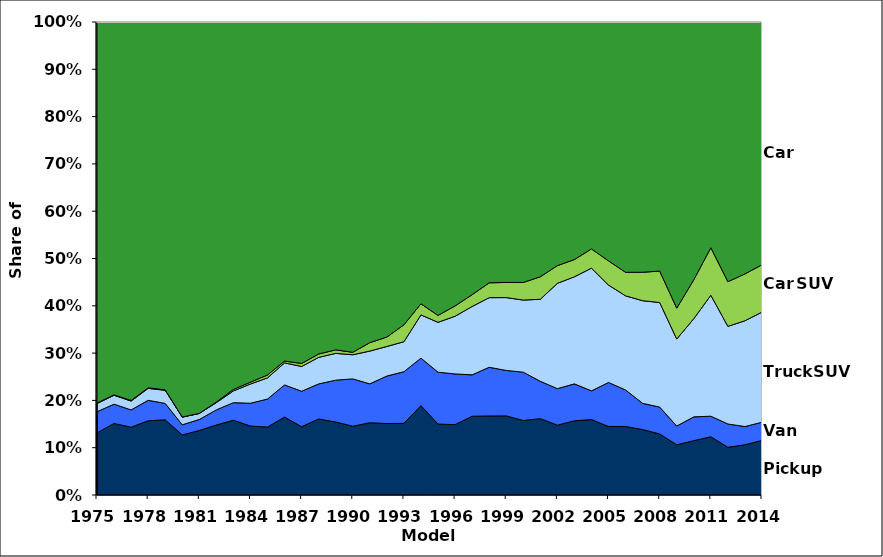
| Category | Pickup | Van | Truck SUV | Car SUV | Car |
|---|---|---|---|---|---|
| 1975.0 | 0.131 | 0.045 | 0.017 | 0.001 | 0.806 |
| 1976.0 | 0.151 | 0.041 | 0.019 | 0.001 | 0.788 |
| 1977.0 | 0.143 | 0.036 | 0.019 | 0.001 | 0.8 |
| 1978.0 | 0.157 | 0.043 | 0.025 | 0.001 | 0.773 |
| 1979.0 | 0.159 | 0.035 | 0.028 | 0.001 | 0.778 |
| 1980.0 | 0.127 | 0.021 | 0.016 | 0 | 0.835 |
| 1981.0 | 0.136 | 0.023 | 0.013 | 0 | 0.827 |
| 1982.0 | 0.148 | 0.032 | 0.015 | 0.001 | 0.803 |
| 1983.0 | 0.158 | 0.037 | 0.025 | 0.003 | 0.777 |
| 1984.0 | 0.146 | 0.048 | 0.041 | 0.004 | 0.761 |
| 1985.0 | 0.144 | 0.059 | 0.045 | 0.006 | 0.746 |
| 1986.0 | 0.165 | 0.068 | 0.046 | 0.004 | 0.717 |
| 1987.0 | 0.144 | 0.075 | 0.052 | 0.006 | 0.722 |
| 1988.0 | 0.161 | 0.074 | 0.056 | 0.007 | 0.702 |
| 1989.0 | 0.154 | 0.088 | 0.057 | 0.007 | 0.693 |
| 1990.0 | 0.145 | 0.1 | 0.051 | 0.005 | 0.698 |
| 1991.0 | 0.153 | 0.082 | 0.069 | 0.018 | 0.678 |
| 1992.0 | 0.151 | 0.1 | 0.062 | 0.02 | 0.666 |
| 1993.0 | 0.152 | 0.109 | 0.063 | 0.036 | 0.64 |
| 1994.0 | 0.189 | 0.1 | 0.091 | 0.023 | 0.596 |
| 1995.0 | 0.15 | 0.11 | 0.105 | 0.015 | 0.62 |
| 1996.0 | 0.149 | 0.107 | 0.122 | 0.022 | 0.6 |
| 1997.0 | 0.167 | 0.088 | 0.145 | 0.025 | 0.576 |
| 1998.0 | 0.167 | 0.103 | 0.147 | 0.031 | 0.551 |
| 1999.0 | 0.167 | 0.096 | 0.154 | 0.032 | 0.551 |
| 2000.0 | 0.158 | 0.102 | 0.152 | 0.037 | 0.551 |
| 2001.0 | 0.161 | 0.079 | 0.173 | 0.048 | 0.539 |
| 2002.0 | 0.148 | 0.077 | 0.223 | 0.037 | 0.515 |
| 2003.0 | 0.157 | 0.078 | 0.226 | 0.036 | 0.502 |
| 2004.0 | 0.159 | 0.061 | 0.259 | 0.041 | 0.48 |
| 2005.0 | 0.145 | 0.093 | 0.206 | 0.051 | 0.505 |
| 2006.0 | 0.145 | 0.077 | 0.199 | 0.05 | 0.529 |
| 2007.0 | 0.138 | 0.055 | 0.217 | 0.06 | 0.529 |
| 2008.0 | 0.129 | 0.057 | 0.221 | 0.066 | 0.527 |
| 2009.0 | 0.106 | 0.04 | 0.184 | 0.065 | 0.605 |
| 2010.0 | 0.115 | 0.05 | 0.208 | 0.082 | 0.545 |
| 2011.0 | 0.123 | 0.043 | 0.256 | 0.101 | 0.477 |
| 2012.0 | 0.101 | 0.049 | 0.206 | 0.094 | 0.549 |
| 2013.0 | 0.106 | 0.038 | 0.224 | 0.099 | 0.533 |
| 2014.0 | 0.115 | 0.039 | 0.233 | 0.1 | 0.513 |